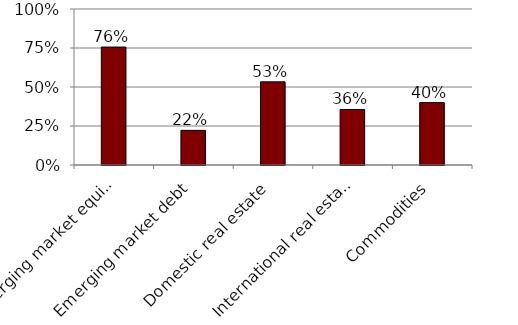
| Category | Series 0 |
|---|---|
| Emerging market equity | 0.756 |
| Emerging market debt | 0.222 |
| Domestic real estate | 0.533 |
| International real estate | 0.356 |
| Commodities | 0.4 |